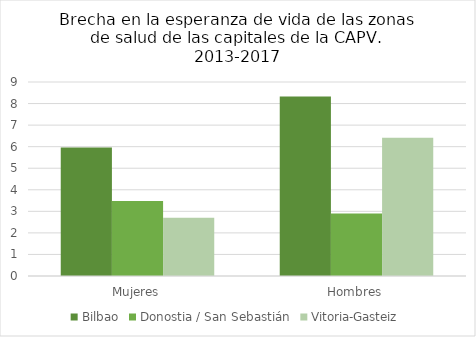
| Category | Bilbao | Donostia / San Sebastián | Vitoria-Gasteiz |
|---|---|---|---|
| Mujeres | 5.96 | 3.48 | 2.7 |
| Hombres | 8.33 | 2.9 | 6.41 |